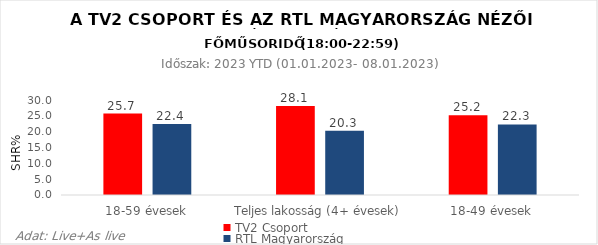
| Category | TV2 Csoport | RTL Magyarország |
|---|---|---|
| 18-59 évesek | 25.7 | 22.4 |
| Teljes lakosság (4+ évesek) | 28.1 | 20.3 |
| 18-49 évesek | 25.2 | 22.3 |